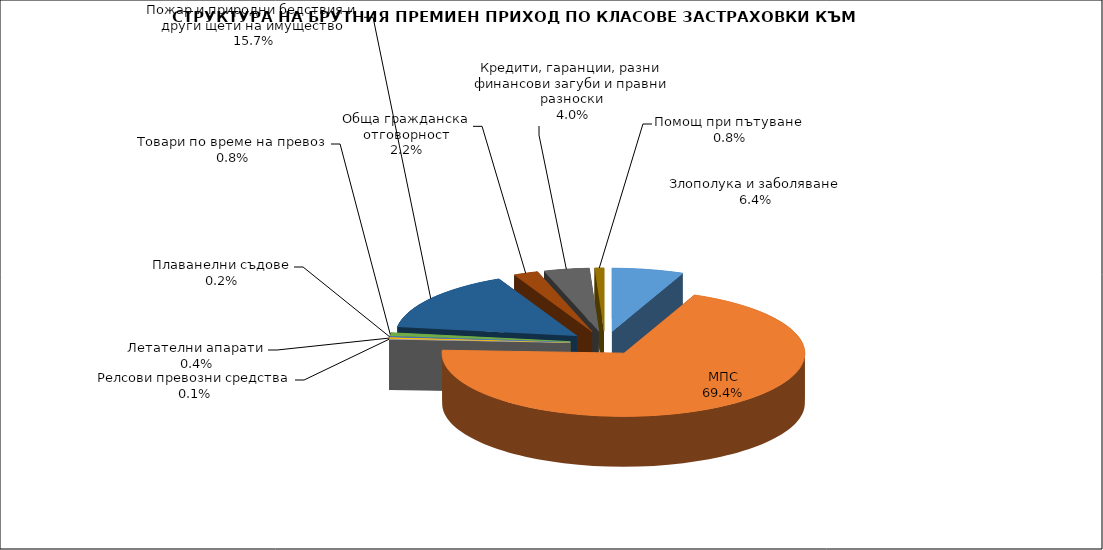
| Category | Злополука и заболяване |
|---|---|
| Злополука и заболяване | 0.064 |
| МПС | 0.694 |
| Релсови превозни средства | 0.001 |
| Летателни апарати | 0.004 |
| Плаванелни съдове | 0.002 |
| Товари по време на превоз | 0.008 |
| Пожар и природни бедствия и други щети на имущество | 0.157 |
| Обща гражданска отговорност | 0.022 |
| Кредити, гаранции, разни финансови загуби и правни разноски | 0.04 |
| Помощ при пътуване | 0.008 |